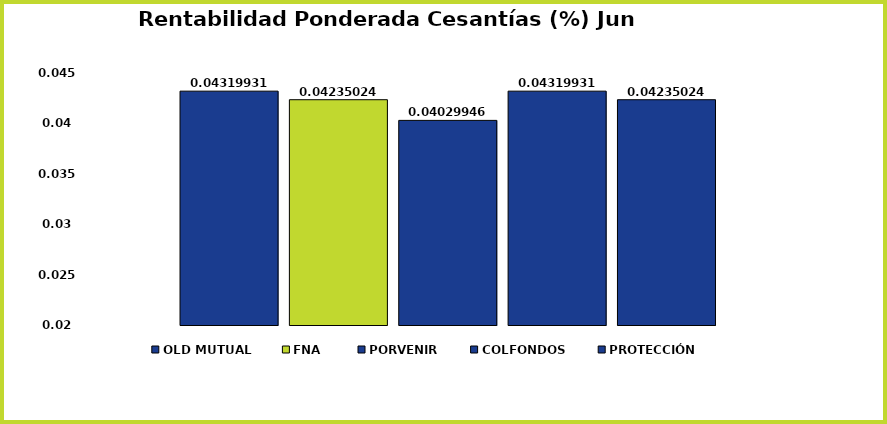
| Category | OLD MUTUAL | FNA | PORVENIR | COLFONDOS | PROTECCIÓN |
|---|---|---|---|---|---|
| 0 | 0.043 | 0.042 | 0.04 | 0.043 | 0.042 |